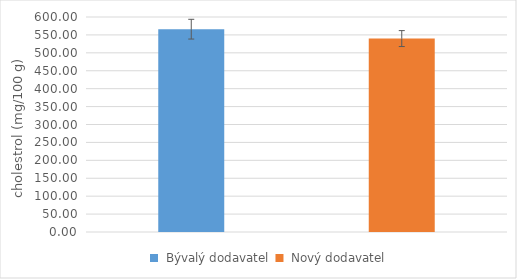
| Category | Series 0 |
|---|---|
|  Bývalý dodavatel  | 566 |
|  Nový dodavatel | 539.8 |